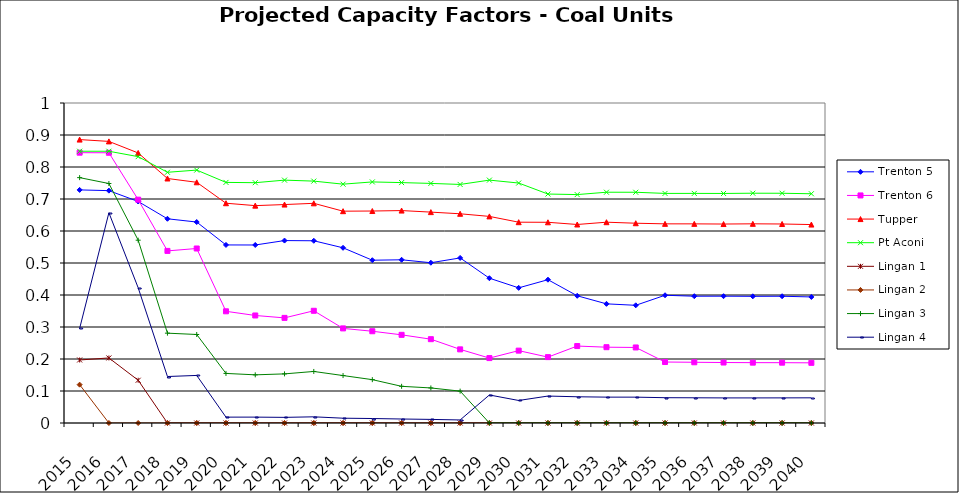
| Category | Trenton 5 | Trenton 6 | Tupper | Pt Aconi | Lingan 1 | Lingan 2 | Lingan 3 | Lingan 4 |
|---|---|---|---|---|---|---|---|---|
| 2015.0 | 0.728 | 0.845 | 0.886 | 0.849 | 0.197 | 0.12 | 0.767 | 0.296 |
| 2016.0 | 0.726 | 0.844 | 0.88 | 0.849 | 0.203 | 0 | 0.748 | 0.657 |
| 2017.0 | 0.692 | 0.698 | 0.844 | 0.832 | 0.134 | 0 | 0.571 | 0.422 |
| 2018.0 | 0.638 | 0.538 | 0.764 | 0.783 | 0 | 0 | 0.281 | 0.145 |
| 2019.0 | 0.628 | 0.545 | 0.752 | 0.79 | 0 | 0 | 0.277 | 0.149 |
| 2020.0 | 0.556 | 0.349 | 0.687 | 0.752 | 0 | 0 | 0.155 | 0.018 |
| 2021.0 | 0.556 | 0.336 | 0.679 | 0.751 | 0 | 0 | 0.15 | 0.018 |
| 2022.0 | 0.57 | 0.328 | 0.683 | 0.759 | 0 | 0 | 0.153 | 0.018 |
| 2023.0 | 0.569 | 0.351 | 0.687 | 0.756 | 0 | 0 | 0.161 | 0.019 |
| 2024.0 | 0.547 | 0.296 | 0.662 | 0.746 | 0 | 0 | 0.148 | 0.015 |
| 2025.0 | 0.509 | 0.287 | 0.662 | 0.753 | 0 | 0 | 0.135 | 0.014 |
| 2026.0 | 0.51 | 0.276 | 0.664 | 0.751 | 0 | 0 | 0.115 | 0.012 |
| 2027.0 | 0.501 | 0.262 | 0.659 | 0.749 | 0 | 0 | 0.11 | 0.011 |
| 2028.0 | 0.516 | 0.23 | 0.654 | 0.746 | 0 | 0 | 0.1 | 0.009 |
| 2029.0 | 0.452 | 0.203 | 0.646 | 0.759 | 0 | 0 | 0 | 0.088 |
| 2030.0 | 0.422 | 0.226 | 0.628 | 0.75 | 0 | 0 | 0 | 0.07 |
| 2031.0 | 0.448 | 0.206 | 0.627 | 0.715 | 0 | 0 | 0 | 0.084 |
| 2032.0 | 0.398 | 0.24 | 0.62 | 0.714 | 0 | 0 | 0 | 0.082 |
| 2033.0 | 0.372 | 0.237 | 0.628 | 0.721 | 0 | 0 | 0 | 0.081 |
| 2034.0 | 0.368 | 0.236 | 0.624 | 0.721 | 0 | 0 | 0 | 0.081 |
| 2035.0 | 0.399 | 0.191 | 0.622 | 0.717 | 0 | 0 | 0 | 0.079 |
| 2036.0 | 0.396 | 0.19 | 0.622 | 0.717 | 0 | 0 | 0 | 0.079 |
| 2037.0 | 0.396 | 0.189 | 0.622 | 0.717 | 0 | 0 | 0 | 0.078 |
| 2038.0 | 0.396 | 0.189 | 0.622 | 0.718 | 0 | 0 | 0 | 0.078 |
| 2039.0 | 0.396 | 0.188 | 0.622 | 0.718 | 0 | 0 | 0 | 0.078 |
| 2040.0 | 0.394 | 0.188 | 0.62 | 0.716 | 0 | 0 | 0 | 0.079 |